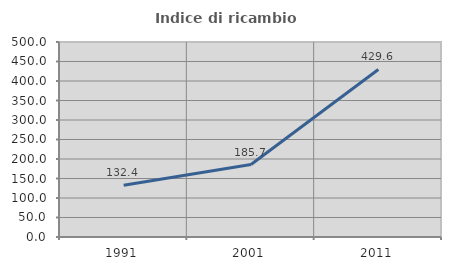
| Category | Indice di ricambio occupazionale  |
|---|---|
| 1991.0 | 132.432 |
| 2001.0 | 185.714 |
| 2011.0 | 429.63 |